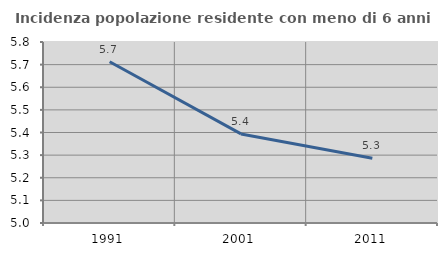
| Category | Incidenza popolazione residente con meno di 6 anni |
|---|---|
| 1991.0 | 5.713 |
| 2001.0 | 5.394 |
| 2011.0 | 5.286 |